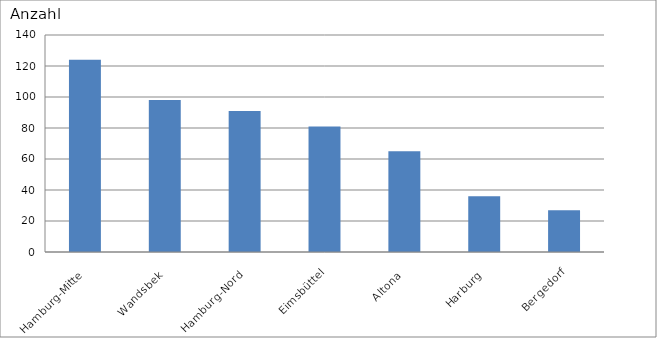
| Category | Hamburg-Mitte |
|---|---|
| Hamburg-Mitte | 124 |
| Wandsbek | 98 |
| Hamburg-Nord | 91 |
| Eimsbüttel | 81 |
| Altona | 65 |
| Harburg | 36 |
| Bergedorf | 27 |